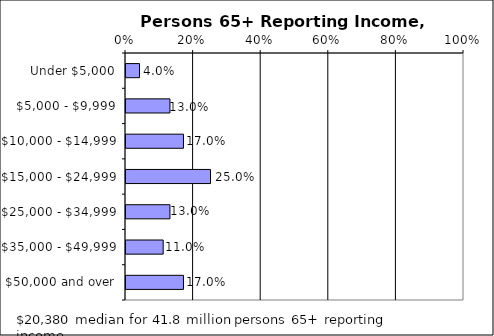
| Category | Persons 65+ Reporting Income Percent of persons |
|---|---|
| Under $5,000 | 0.04 |
| $5,000 - $9,999 | 0.13 |
| $10,000 - $14,999 | 0.17 |
| $15,000 - $24,999 | 0.25 |
| $25,000 - $34,999 | 0.13 |
| $35,000 - $49,999 | 0.11 |
| $50,000 and over | 0.17 |